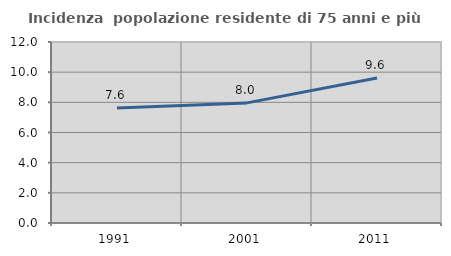
| Category | Incidenza  popolazione residente di 75 anni e più |
|---|---|
| 1991.0 | 7.616 |
| 2001.0 | 7.963 |
| 2011.0 | 9.615 |